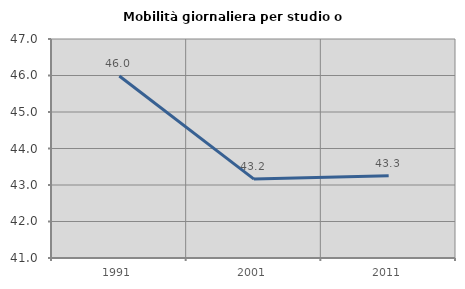
| Category | Mobilità giornaliera per studio o lavoro |
|---|---|
| 1991.0 | 45.987 |
| 2001.0 | 43.162 |
| 2011.0 | 43.251 |